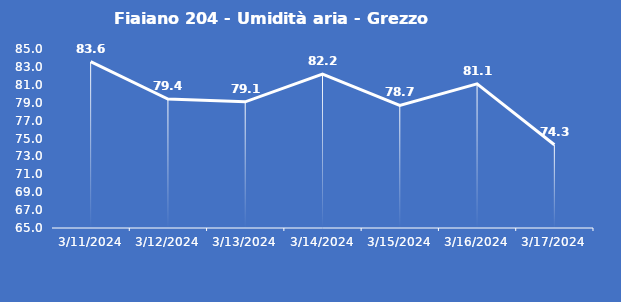
| Category | Fiaiano 204 - Umidità aria - Grezzo (%) |
|---|---|
| 3/11/24 | 83.6 |
| 3/12/24 | 79.4 |
| 3/13/24 | 79.1 |
| 3/14/24 | 82.2 |
| 3/15/24 | 78.7 |
| 3/16/24 | 81.1 |
| 3/17/24 | 74.3 |